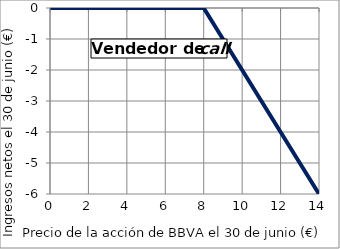
| Category | Comprador |
|---|---|
| 0.0 | 0 |
| 1.0 | 0 |
| 2.0 | 0 |
| 3.0 | 0 |
| 4.0 | 0 |
| 5.0 | 0 |
| 6.0 | 0 |
| 7.0 | 0 |
| 8.0 | 0 |
| 9.0 | -1 |
| 10.0 | -2 |
| 11.0 | -3 |
| 12.0 | -4 |
| 13.0 | -5 |
| 14.0 | -6 |